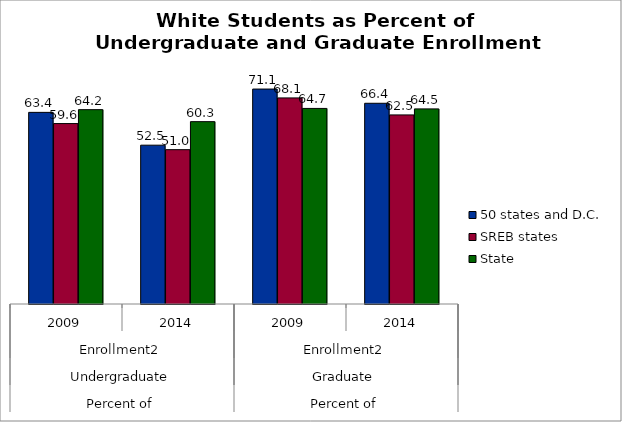
| Category | 50 states and D.C. | SREB states | State |
|---|---|---|---|
| 0 | 63.352 | 59.646 | 64.249 |
| 1 | 52.504 | 51.02 | 60.28 |
| 2 | 71.057 | 68.128 | 64.651 |
| 3 | 66.354 | 62.509 | 64.501 |